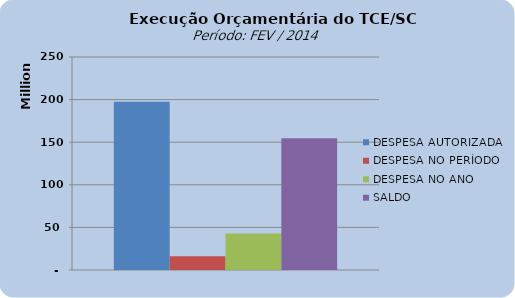
| Category | DESPESA AUTORIZADA | DESPESA NO PERÍODO | DESPESA NO ANO | SALDO |
|---|---|---|---|---|
| 0 | 197421616.07 | 16231738.36 | 42779686.64 | 154641929.43 |